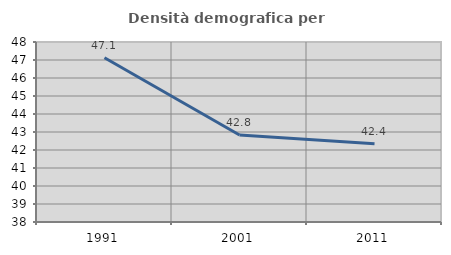
| Category | Densità demografica |
|---|---|
| 1991.0 | 47.122 |
| 2001.0 | 42.83 |
| 2011.0 | 42.353 |